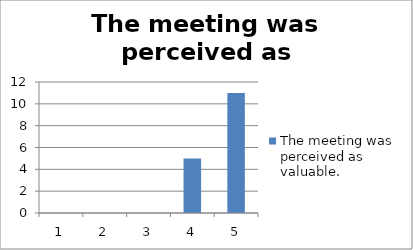
| Category | The meeting was perceived as valuable. |
|---|---|
| 0 | 0 |
| 1 | 0 |
| 2 | 0 |
| 3 | 5 |
| 4 | 11 |